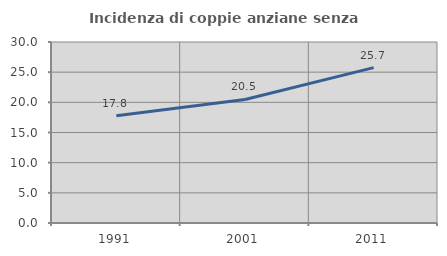
| Category | Incidenza di coppie anziane senza figli  |
|---|---|
| 1991.0 | 17.794 |
| 2001.0 | 20.475 |
| 2011.0 | 25.746 |